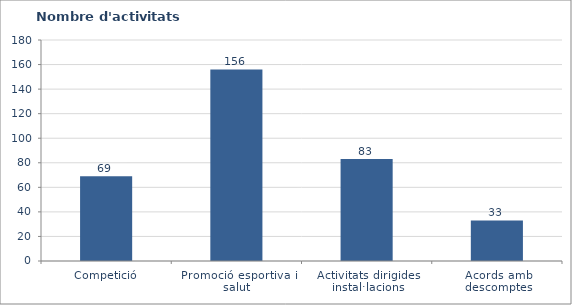
| Category | Nombre d'activitats ofertades |
|---|---|
| Competició | 69 |
| Promoció esportiva i salut | 156 |
| Activitats dirigides instal·lacions | 83 |
| Acords amb descomptes | 33 |